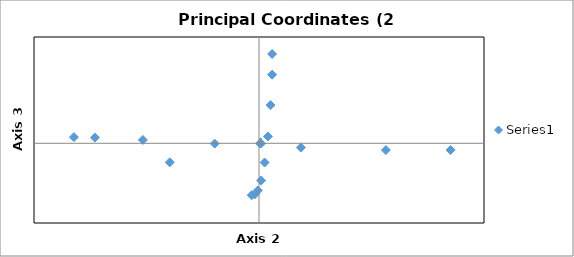
| Category | Series 0 |
|---|---|
| -0.03244341383977934 | -0.391 |
| -0.01926439843513157 | -0.385 |
| -0.005306913910411438 | -0.355 |
| 0.009588831884647197 | -0.28 |
| 0.024909859136307295 | -0.145 |
| 0.03944480386342308 | 0.052 |
| 0.05134949330883127 | 0.287 |
| 0.05836087425447062 | 0.517 |
| 0.05819389533984014 | 0.672 |
| -0.822723139214623 | 0.046 |
| -0.7290838345587126 | 0.043 |
| -0.5160763650196898 | 0.025 |
| -0.1970232478292263 | -0.003 |
| 0.18597403230300072 | -0.032 |
| 0.5638888627602934 | -0.051 |
| 0.851467629743046 | -0.05 |
| -0.39663975782361516 | -0.143 |
| 0.00683892785970109 | 0.002 |
| 0.006838927860505473 | 0.002 |
| 0.0068389278618960336 | 0.002 |
| 0.006838927863338644 | 0.002 |
| 0.0068389278648327756 | 0.002 |
| 0.006838927866377978 | 0.002 |
| 0.006838927867973668 | 0.002 |
| 0.0068389278696193625 | 0.002 |
| 0.006838927871314542 | 0.002 |
| 0.006838927873058717 | 0.002 |
| 0.006838927874851362 | 0.002 |
| 0.006838927876692004 | 0.002 |
| 0.00683892787858014 | 0.002 |
| 0.006838927880515293 | 0.002 |
| 0.00683892788249698 | 0.002 |
| 0.006838927884524727 | 0.002 |
| 0.006838927886598035 | 0.002 |
| 0.006838927888716489 | 0.002 |
| 0.006838927890879588 | 0.002 |
| 0.006838927893086883 | 0.002 |
| 0.006838927895337903 | 0.002 |
| 0.0068389278976322 | 0.002 |
| 0.0068389278999693775 | 0.002 |
| 0.006838927902348925 | 0.002 |
| 0.006838927904770432 | 0.002 |
| 0.006838927907233468 | 0.002 |
| 0.0068389279097375855 | 0.002 |
| 0.006838927912282383 | 0.002 |
| 0.006838927914867403 | 0.002 |
| 0.006838927917492267 | 0.002 |
| 0.006838927920156507 | 0.002 |
| 0.006838927922859773 | 0.002 |
| 0.006838927925601608 | 0.002 |
| 0.006838927928381623 | 0.002 |
| 0.0068389279311994395 | 0.002 |
| 0.006838927934054633 | 0.002 |
| 0.006838927936946829 | 0.002 |
| 0.006838927939875619 | 0.002 |
| 0.00683892794284063 | 0.002 |
| 0.006838927945841461 | 0.002 |
| 0.006838927948877755 | 0.002 |
| 0.0068389279519491366 | 0.002 |
| 0.006838927955055212 | 0.002 |
| 0.006838927958195645 | 0.002 |
| 0.006838927961370022 | 0.002 |
| 0.006838927964578036 | 0.002 |
| 0.006838927967819272 | 0.002 |
| 0.006838927971093424 | 0.002 |
| 0.006838927974400102 | 0.002 |
| 0.006838927977738984 | 0.002 |
| 0.006838927981109693 | 0.002 |
| 0.006838927984511914 | 0.002 |
| 0.006838927987945306 | 0.002 |
| 0.006838927991409543 | 0.002 |
| 0.0068389279949042335 | 0.002 |
| 0.006838927998429096 | 0.002 |
| 0.006838928001983803 | 0.002 |
| 0.006838928005568006 | 0.002 |
| 0.006838928009181389 | 0.002 |
| 0.006838928012823638 | 0.002 |
| 0.006838928016494454 | 0.002 |
| 0.006838928020193498 | 0.002 |
| 0.00683892802392046 | 0.002 |
| 0.0068389280276750395 | 0.002 |
| 0.0068389280314569275 | 0.002 |
| 0.0068389280352658555 | 0.002 |
| 0.006838928039101453 | 0.002 |
| 0.006838928042963492 | 0.002 |
| 0.006838928046851637 | 0.002 |
| 0.00683892805076561 | 0.002 |
| 0.006838928054705133 | 0.002 |
| 0.006838928058669899 | 0.002 |
| 0.006838928062659617 | 0.002 |
| 0.006838928066674029 | 0.002 |
| 0.006838928070712863 | 0.002 |
| 0.00683892807477581 | 0.002 |
| 0.006838928078862622 | 0.002 |
| 0.006838928082973024 | 0.002 |
| 0.006838928087106727 | 0.002 |
| 0.006838928091263515 | 0.002 |
| 0.00683892809544307 | 0.002 |
| 0.0068389280996451396 | 0.002 |
| 0.00683892810386949 | 0.002 |
| 0.0068389281081158325 | 0.002 |
| 0.006838928112383927 | 0.002 |
| 0.006838928116673517 | 0.002 |
| 0.006838928120984354 | 0.002 |
| 0.006838928125316213 | 0.002 |
| 0.006838928129668807 | 0.002 |
| 0.006838928134041929 | 0.002 |
| 0.006838928138435293 | 0.002 |
| 0.006838928142848696 | 0.002 |
| 0.006838928147281901 | 0.002 |
| 0.006838928151734662 | 0.002 |
| 0.006838928156206735 | 0.002 |
| 0.006838928160697912 | 0.002 |
| 0.006838928165207973 | 0.002 |
| 0.006838928169736627 | 0.002 |
| 0.006838928174283751 | 0.002 |
| 0.006838928178849023 | 0.002 |
| 0.006838928183432267 | 0.002 |
| 0.006838928188033272 | 0.002 |
| 0.006838928192651814 | 0.002 |
| 0.006838928197287673 | 0.002 |
| 0.006838928201940607 | 0.002 |
| 0.006838928206610451 | 0.002 |
| 0.0068389282112970105 | 0.002 |
| 0.006838928216000006 | 0.002 |
| 0.006838928220719281 | 0.002 |
| 0.006838928225454645 | 0.002 |
| 0.006838928230205844 | 0.002 |
| 0.006838928234972725 | 0.002 |
| 0.0068389282397550676 | 0.002 |
| 0.006838928244552676 | 0.002 |
| 0.0068389282493653645 | 0.002 |
| 0.006838928254192925 | 0.002 |
| 0.006838928259035181 | 0.002 |
| 0.006838928263891934 | 0.002 |
| 0.006838928268763012 | 0.002 |
| 0.006838928273648211 | 0.002 |
| 0.006838928278547355 | 0.002 |
| 0.006838928283460239 | 0.002 |
| 0.00683892828838671 | 0.002 |
| 0.006838928293326579 | 0.002 |
| 0.006838928298279671 | 0.002 |
| 0.006838928303245779 | 0.002 |
| 0.006838928308224769 | 0.002 |
| 0.006838928313216458 | 0.002 |